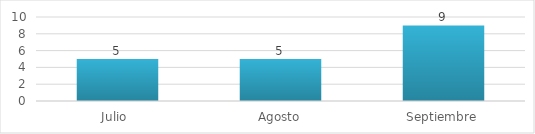
| Category | Series 0 |
|---|---|
| Julio  | 5 |
| Agosto | 5 |
| Septiembre | 9 |